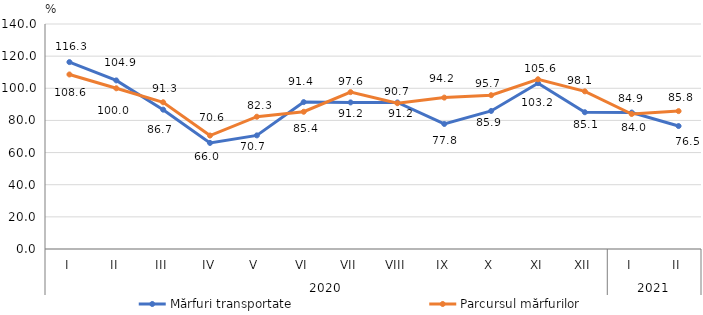
| Category | Mărfuri transportate | Parcursul mărfurilor |
|---|---|---|
| 0 | 116.3 | 108.6 |
| 1 | 104.9 | 100 |
| 2 | 86.7 | 91.3 |
| 3 | 66 | 70.6 |
| 4 | 70.7 | 82.3 |
| 5 | 91.4 | 85.4 |
| 6 | 91.2 | 97.6 |
| 7 | 91.2 | 90.7 |
| 8 | 77.8 | 94.2 |
| 9 | 85.9 | 95.7 |
| 10 | 103.2 | 105.6 |
| 11 | 85.1 | 98.1 |
| 12 | 84.9 | 84 |
| 13 | 76.5 | 85.8 |